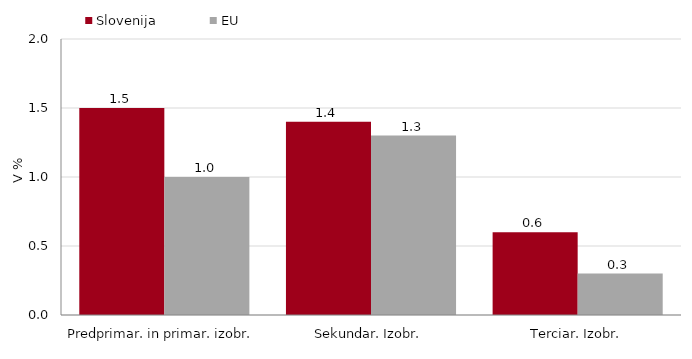
| Category | Slovenija | EU |
|---|---|---|
| Predprimar. in primar. izobr. | 1.5 | 1 |
| Sekundar. Izobr. | 1.4 | 1.3 |
| Terciar. Izobr. | 0.6 | 0.3 |